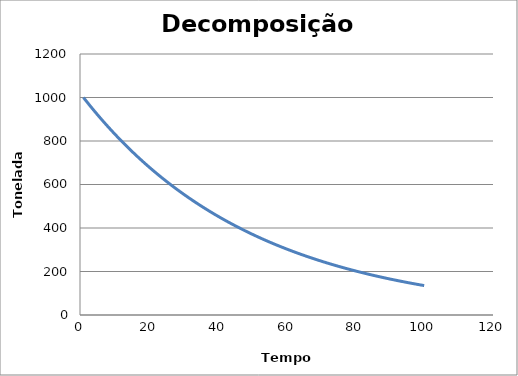
| Category | Series 0 |
|---|---|
| 1.0 | 1000 |
| 2.0 | 980 |
| 3.0 | 960.4 |
| 4.0 | 941.192 |
| 5.0 | 922.368 |
| 6.0 | 903.921 |
| 7.0 | 885.842 |
| 8.0 | 868.126 |
| 9.0 | 850.763 |
| 10.0 | 833.748 |
| 11.0 | 817.073 |
| 12.0 | 800.731 |
| 13.0 | 784.717 |
| 14.0 | 769.022 |
| 15.0 | 753.642 |
| 16.0 | 738.569 |
| 17.0 | 723.798 |
| 18.0 | 709.322 |
| 19.0 | 695.135 |
| 20.0 | 681.233 |
| 21.0 | 667.608 |
| 22.0 | 654.256 |
| 23.0 | 641.171 |
| 24.0 | 628.347 |
| 25.0 | 615.78 |
| 26.0 | 603.465 |
| 27.0 | 591.395 |
| 28.0 | 579.568 |
| 29.0 | 567.976 |
| 30.0 | 556.617 |
| 31.0 | 545.484 |
| 32.0 | 534.575 |
| 33.0 | 523.883 |
| 34.0 | 513.405 |
| 35.0 | 503.137 |
| 36.0 | 493.075 |
| 37.0 | 483.213 |
| 38.0 | 473.549 |
| 39.0 | 464.078 |
| 40.0 | 454.796 |
| 41.0 | 445.7 |
| 42.0 | 436.786 |
| 43.0 | 428.051 |
| 44.0 | 419.49 |
| 45.0 | 411.1 |
| 46.0 | 402.878 |
| 47.0 | 394.82 |
| 48.0 | 386.924 |
| 49.0 | 379.185 |
| 50.0 | 371.602 |
| 51.0 | 364.17 |
| 52.0 | 356.886 |
| 53.0 | 349.749 |
| 54.0 | 342.754 |
| 55.0 | 335.899 |
| 56.0 | 329.181 |
| 57.0 | 322.597 |
| 58.0 | 316.145 |
| 59.0 | 309.822 |
| 60.0 | 303.626 |
| 61.0 | 297.553 |
| 62.0 | 291.602 |
| 63.0 | 285.77 |
| 64.0 | 280.055 |
| 65.0 | 274.454 |
| 66.0 | 268.964 |
| 67.0 | 263.585 |
| 68.0 | 258.313 |
| 69.0 | 253.147 |
| 70.0 | 248.084 |
| 71.0 | 243.123 |
| 72.0 | 238.26 |
| 73.0 | 233.495 |
| 74.0 | 228.825 |
| 75.0 | 224.249 |
| 76.0 | 219.764 |
| 77.0 | 215.368 |
| 78.0 | 211.061 |
| 79.0 | 206.84 |
| 80.0 | 202.703 |
| 81.0 | 198.649 |
| 82.0 | 194.676 |
| 83.0 | 190.782 |
| 84.0 | 186.967 |
| 85.0 | 183.227 |
| 86.0 | 179.563 |
| 87.0 | 175.972 |
| 88.0 | 172.452 |
| 89.0 | 169.003 |
| 90.0 | 165.623 |
| 91.0 | 162.311 |
| 92.0 | 159.064 |
| 93.0 | 155.883 |
| 94.0 | 152.765 |
| 95.0 | 149.71 |
| 96.0 | 146.716 |
| 97.0 | 143.782 |
| 98.0 | 140.906 |
| 99.0 | 138.088 |
| 100.0 | 135.326 |